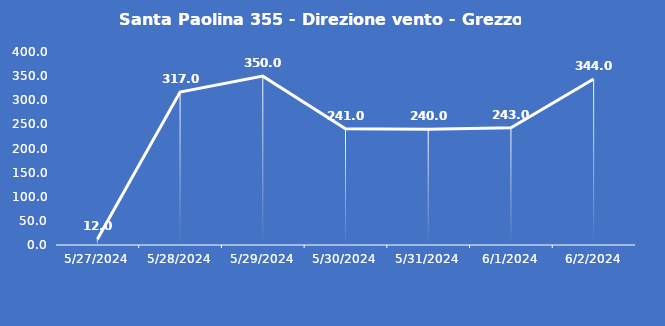
| Category | Santa Paolina 355 - Direzione vento - Grezzo (°N) |
|---|---|
| 5/27/24 | 12 |
| 5/28/24 | 317 |
| 5/29/24 | 350 |
| 5/30/24 | 241 |
| 5/31/24 | 240 |
| 6/1/24 | 243 |
| 6/2/24 | 344 |